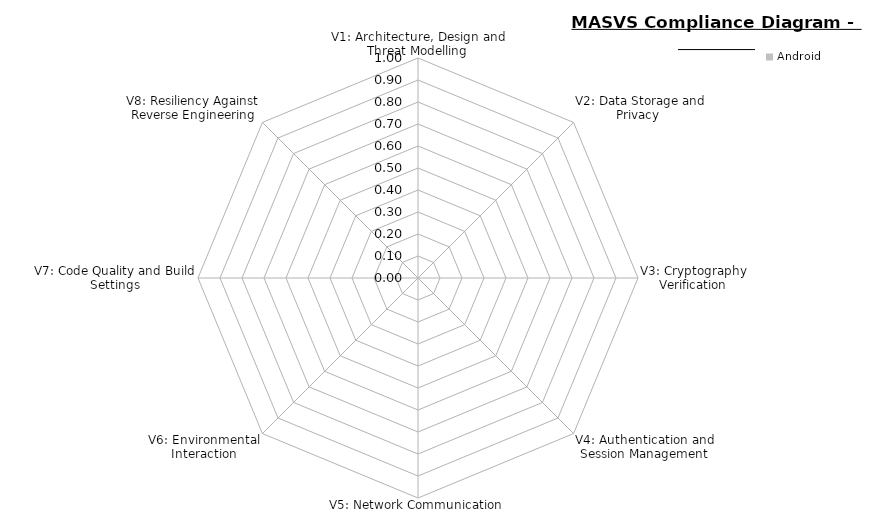
| Category | Android |
|---|---|
| V1: Architecture, Design and Threat Modelling | 0 |
| V2: Data Storage and Privacy  | 0 |
| V3: Cryptography Verification | 0 |
| V4: Authentication and Session Management | 0 |
| V5: Network Communication | 0 |
| V6: Environmental Interaction | 0 |
| V7: Code Quality and Build Settings | 0 |
| V8: Resiliency Against Reverse Engineering | 0 |